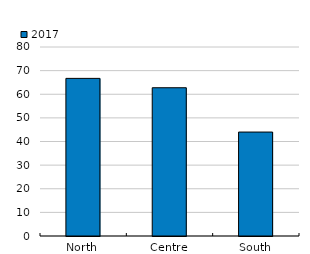
| Category | 2017 |
|---|---|
| North | 66.714 |
| Centre | 62.755 |
| South | 44 |